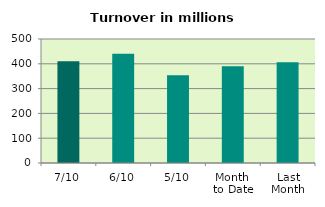
| Category | Series 0 |
|---|---|
| 7/10 | 409.861 |
| 6/10 | 440.455 |
| 5/10 | 354.227 |
| Month 
to Date | 390.072 |
| Last
Month | 405.806 |